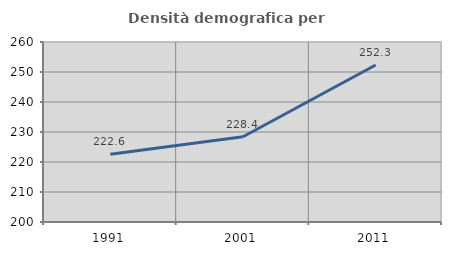
| Category | Densità demografica |
|---|---|
| 1991.0 | 222.593 |
| 2001.0 | 228.416 |
| 2011.0 | 252.329 |